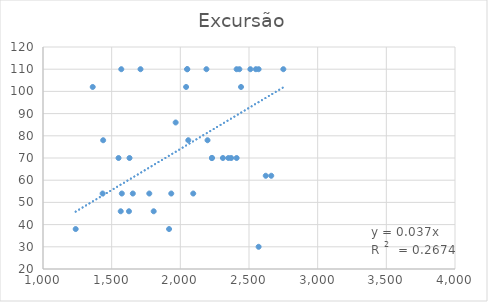
| Category | Excursão |
|---|---|
| 1550.0 | 70 |
| 2310.0 | 70 |
| 1570.0 | 110 |
| 2042.0 | 102 |
| 1934.0 | 54 |
| 1630.0 | 70 |
| 1574.0 | 54 |
| 1566.0 | 46 |
| 2050.0 | 110 |
| 2350.0 | 70 |
| 1918.0 | 38 |
| 1438.0 | 78 |
| 1654.0 | 54 |
| 2058.0 | 78 |
| 2442.0 | 102 |
| 2050.0 | 110 |
| 1966.0 | 86 |
| 2550.0 | 110 |
| 2198.0 | 78 |
| 1626.0 | 46 |
| 2510.0 | 110 |
| 2410.0 | 110 |
| 2622.0 | 62 |
| 1362.0 | 102 |
| 2750.0 | 110 |
| 1806.0 | 46 |
| 2190.0 | 110 |
| 2430.0 | 110 |
| 2094.0 | 54 |
| 2570.0 | 30 |
| 2410.0 | 70 |
| 1774.0 | 54 |
| 1710.0 | 110 |
| 2370.0 | 70 |
| 2230.0 | 70 |
| 2570.0 | 110 |
| 2662.0 | 62 |
| 1238.0 | 38 |
| 2230.0 | 70 |
| 1434.0 | 54 |